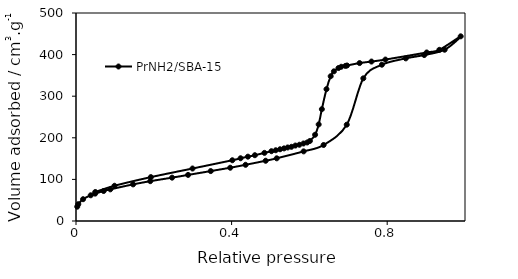
| Category | PrNH2/SBA-15 |
|---|---|
| 0.003211 | 34.402 |
| 0.005936 | 40.459 |
| 0.018156 | 52.376 |
| 0.037838 | 61.787 |
| 0.049331 | 65.821 |
| 0.071043 | 72.073 |
| 0.088281 | 76.083 |
| 0.146774 | 88.039 |
| 0.190862 | 95.714 |
| 0.246982 | 104.206 |
| 0.288124 | 110.782 |
| 0.346399 | 120 |
| 0.396483 | 128.047 |
| 0.435972 | 135.092 |
| 0.487568 | 144.79 |
| 0.516025 | 150.691 |
| 0.585123 | 167.368 |
| 0.636518 | 182.704 |
| 0.696041 | 231.516 |
| 0.738638 | 342.909 |
| 0.786393 | 375.707 |
| 0.847756 | 390.935 |
| 0.895118 | 398.92 |
| 0.947708 | 411.743 |
| 0.98896 | 443.908 |
| 0.934112 | 411.48 |
| 0.901494 | 405.088 |
| 0.79544 | 388.062 |
| 0.759582 | 383.286 |
| 0.729025 | 379.633 |
| 0.696742 | 373.781 |
| 0.692431 | 372.837 |
| 0.681813 | 370.749 |
| 0.674697 | 367.685 |
| 0.662959 | 359.735 |
| 0.654738 | 348.035 |
| 0.643923 | 316.944 |
| 0.632036 | 268.81 |
| 0.623849 | 232.109 |
| 0.614647 | 207.302 |
| 0.60119 | 192.27 |
| 0.594349 | 188.738 |
| 0.584812 | 186.348 |
| 0.574281 | 183.302 |
| 0.563927 | 181.347 |
| 0.553798 | 178.334 |
| 0.544103 | 176.732 |
| 0.534726 | 174.532 |
| 0.524462 | 172.416 |
| 0.513518 | 170.021 |
| 0.502433 | 167.795 |
| 0.484438 | 163.767 |
| 0.459816 | 158.13 |
| 0.441927 | 154.64 |
| 0.423024 | 150.815 |
| 0.401816 | 146.017 |
| 0.299531 | 126.172 |
| 0.192438 | 105.477 |
| 0.099048 | 84.701 |
| 0.049581 | 69.711 |